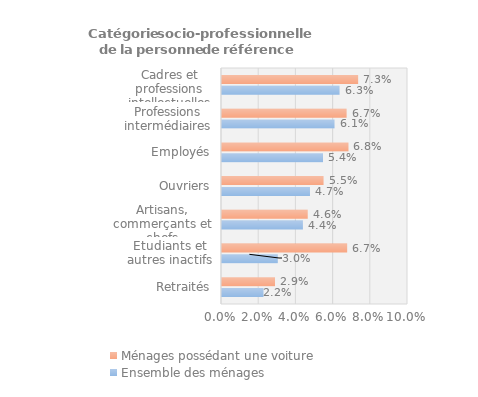
| Category | Ensemble des ménages | Ménages possédant une voiture |
|---|---|---|
| Retraités | 0.022 | 0.028 |
| Etudiants et autres inactifs | 0.03 | 0.067 |
| Artisans, commerçants et chefs d'entreprise ¹ | 0.044 | 0.046 |
| Ouvriers | 0.047 | 0.055 |
| Employés | 0.054 | 0.068 |
| Professions intermédiaires | 0.06 | 0.067 |
| Cadres et professions intellectuelles supérieures | 0.063 | 0.073 |